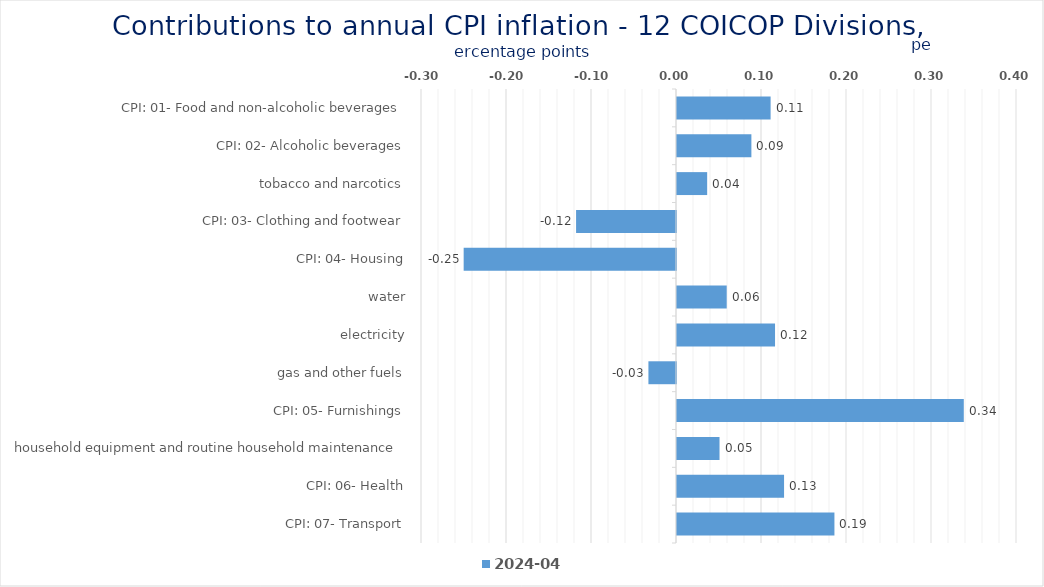
| Category | 2024-04 |
|---|---|
| CPI: 01- Food and non-alcoholic beverages | 0.11 |
| CPI: 02- Alcoholic beverages, tobacco and narcotics | 0.088 |
| CPI: 03- Clothing and footwear | 0.035 |
| CPI: 04- Housing, water, electricity, gas and other fuels | -0.118 |
| CPI: 05- Furnishings, household equipment and routine household maintenance | -0.25 |
| CPI: 06- Health | 0.058 |
| CPI: 07- Transport | 0.115 |
| CPI: 08- Communication | -0.032 |
| CPI: 09- Recreation and culture | 0.337 |
| CPI: 10- Education | 0.05 |
| CPI: 11- Restaurants and hotels | 0.126 |
| CPI: 12- Miscellaneous goods and services | 0.185 |